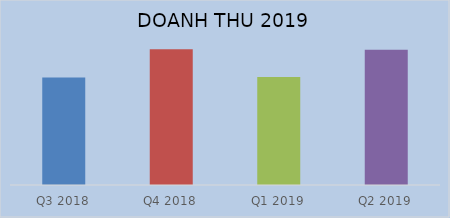
| Category | Doanh thu thuần |
|---|---|
| Q3 2018 | 1334067229409 |
| Q4 2018 | 1685142616160 |
| Q1 2019 | 1339524002999 |
| Q2 2019 | 1677767699599 |